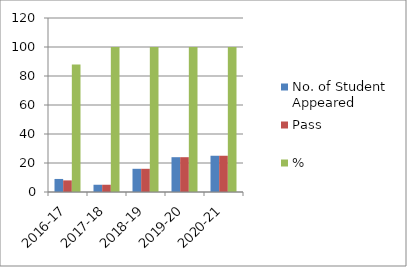
| Category | No. of Student Appeared | Pass | % |
|---|---|---|---|
| 2016-17 | 9 | 8 | 88 |
| 2017-18 | 5 | 5 | 100 |
| 2018-19 | 16 | 16 | 100 |
| 2019-20 | 24 | 24 | 100 |
| 2020-21 | 25 | 25 | 100 |